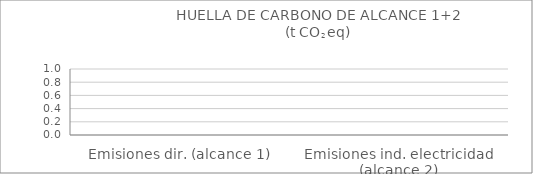
| Category | Series 0 |
|---|---|
| Emisiones dir. (alcance 1) | 0 |
| Emisiones ind. electricidad (alcance 2) | 0 |